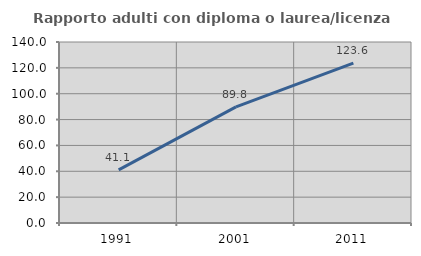
| Category | Rapporto adulti con diploma o laurea/licenza media  |
|---|---|
| 1991.0 | 41.139 |
| 2001.0 | 89.796 |
| 2011.0 | 123.59 |